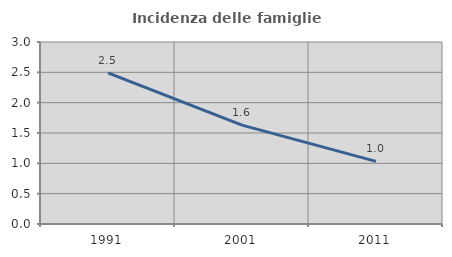
| Category | Incidenza delle famiglie numerose |
|---|---|
| 1991.0 | 2.491 |
| 2001.0 | 1.63 |
| 2011.0 | 1.033 |